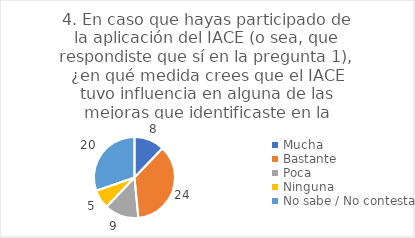
| Category | 4. En caso que hayas participado de la aplicación del IACE (o sea, que respondiste que sí en la pregunta 1), ¿en qué medida crees que el IACE tuvo influencia en alguna de las mejoras que identificaste en la pregunta anterior? |
|---|---|
| Mucha  | 0.121 |
| Bastante  | 0.364 |
| Poca  | 0.136 |
| Ninguna  | 0.076 |
| No sabe / No contesta | 0.303 |